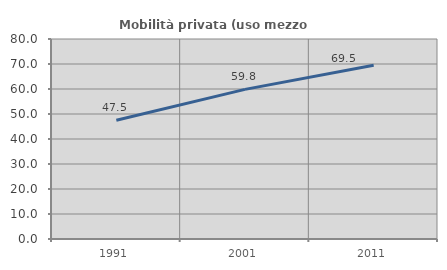
| Category | Mobilità privata (uso mezzo privato) |
|---|---|
| 1991.0 | 47.48 |
| 2001.0 | 59.845 |
| 2011.0 | 69.503 |